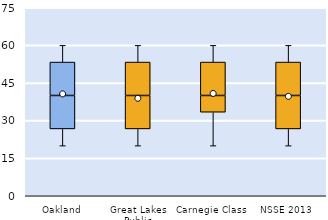
| Category | 25th | 50th | 75th |
|---|---|---|---|
| Oakland | 26.667 | 13.333 | 13.333 |
| Great Lakes Public | 26.667 | 13.333 | 13.333 |
| Carnegie Class | 33.333 | 6.667 | 13.333 |
| NSSE 2013 | 26.667 | 13.333 | 13.333 |